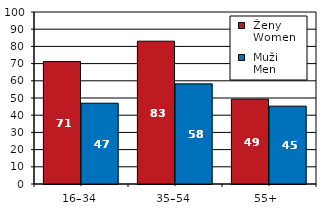
| Category |  Ženy 
 Women |  Muži 
 Men |
|---|---|---|
| 16–34 | 71.17 | 46.96 |
| 35–54 | 83.03 | 58.22 |
| 55+  | 49.31 | 45.25 |